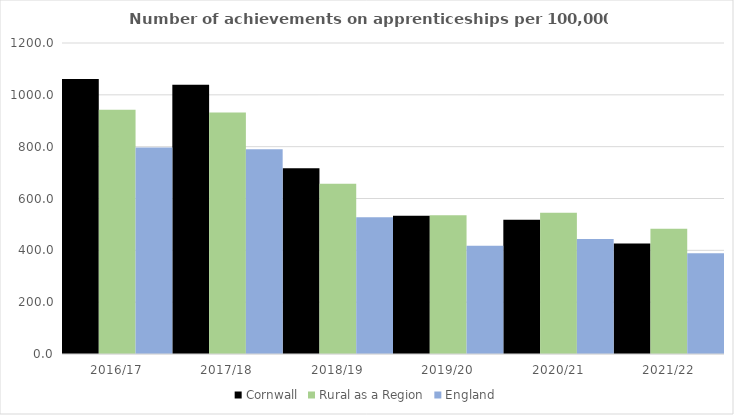
| Category | Cornwall | Rural as a Region | England |
|---|---|---|---|
| 2016/17 | 1061 | 942.594 | 797 |
| 2017/18 | 1039 | 931.709 | 790 |
| 2018/19 | 717 | 656.44 | 528 |
| 2019/20 | 533 | 535.552 | 418 |
| 2020/21 | 518 | 545.333 | 444 |
| 2021/22 | 426 | 482.936 | 389 |